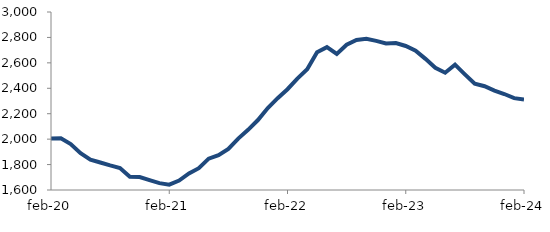
| Category | Series 0 |
|---|---|
| 2020-02-01 | 2004.612 |
| 2020-03-01 | 2005.967 |
| 2020-04-01 | 1961.731 |
| 2020-05-01 | 1889.917 |
| 2020-06-01 | 1839.086 |
| 2020-07-01 | 1816.171 |
| 2020-08-01 | 1793.174 |
| 2020-09-01 | 1772.502 |
| 2020-10-01 | 1703.481 |
| 2020-11-01 | 1701.776 |
| 2020-12-01 | 1677.184 |
| 2021-01-01 | 1654.072 |
| 2021-02-01 | 1641.869 |
| 2021-03-01 | 1673.821 |
| 2021-04-01 | 1730.759 |
| 2021-05-01 | 1771.425 |
| 2021-06-01 | 1846.573 |
| 2021-07-01 | 1874.111 |
| 2021-08-01 | 1922.894 |
| 2021-09-01 | 2004.225 |
| 2021-10-01 | 2073.331 |
| 2021-11-01 | 2150.314 |
| 2021-12-01 | 2244.492 |
| 2022-01-01 | 2321.95 |
| 2022-02-01 | 2392.65 |
| 2022-03-01 | 2476.383 |
| 2022-04-01 | 2549.069 |
| 2022-05-01 | 2683.336 |
| 2022-06-01 | 2723.868 |
| 2022-07-01 | 2670.585 |
| 2022-08-01 | 2742.913 |
| 2022-09-01 | 2780.46 |
| 2022-10-01 | 2788.916 |
| 2022-11-01 | 2772.628 |
| 2022-12-01 | 2752.307 |
| 2023-01-01 | 2755.69 |
| 2023-02-01 | 2732.653 |
| 2023-03-01 | 2696.107 |
| 2023-04-01 | 2631.454 |
| 2023-05-01 | 2561.826 |
| 2023-06-01 | 2522.703 |
| 2023-07-01 | 2586.296 |
| 2023-08-01 | 2509.777 |
| 2023-09-01 | 2436.109 |
| 2023-10-01 | 2416.11 |
| 2023-11-01 | 2381.816 |
| 2023-12-01 | 2354.903 |
| 2024-01-01 | 2322.347 |
| 2024-02-01 | 2311.108 |